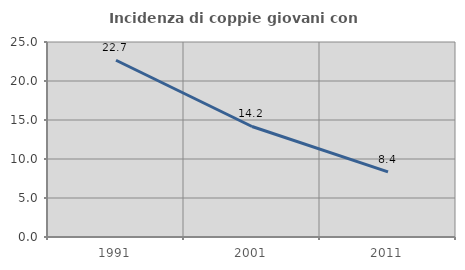
| Category | Incidenza di coppie giovani con figli |
|---|---|
| 1991.0 | 22.663 |
| 2001.0 | 14.169 |
| 2011.0 | 8.353 |